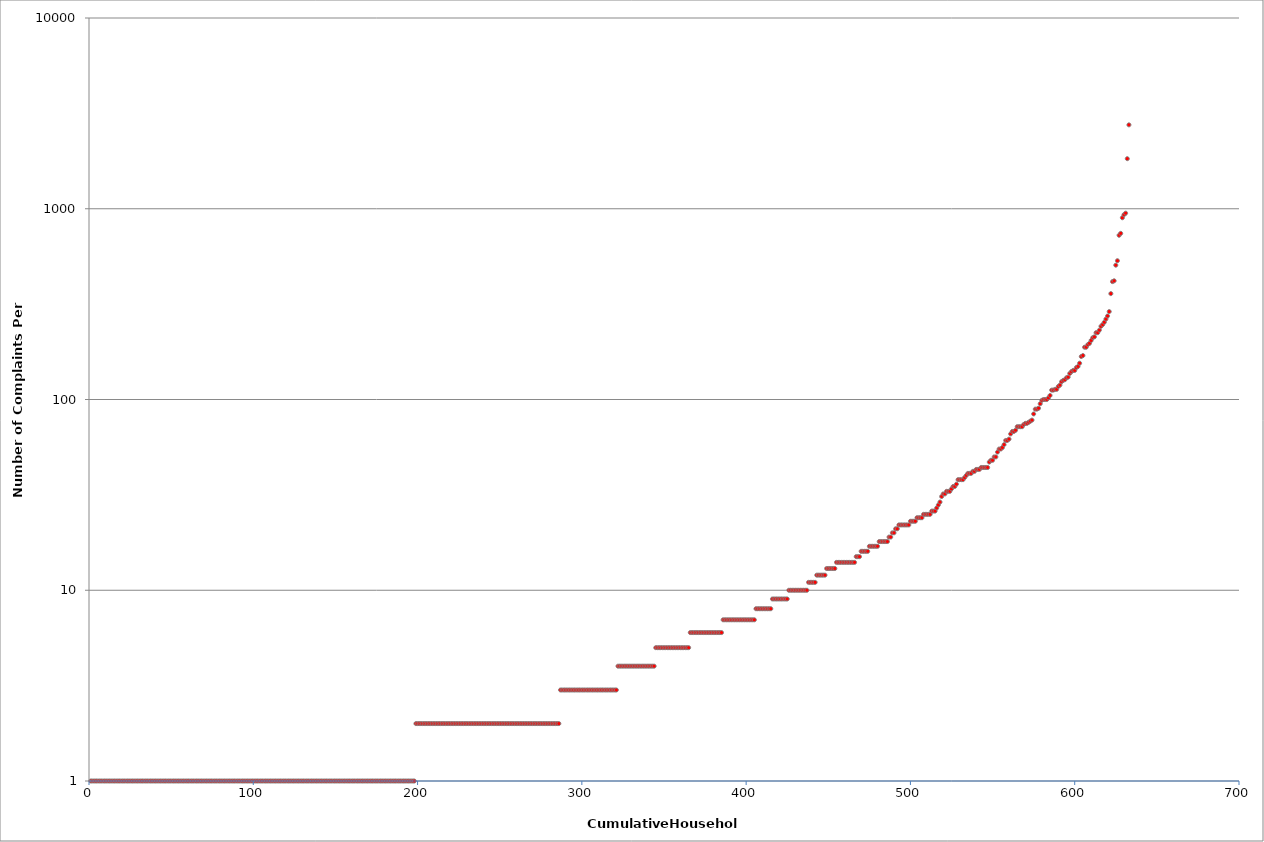
| Category | Series 0 |
|---|---|
| 1.0 | 1 |
| 2.0 | 1 |
| 3.0 | 1 |
| 4.0 | 1 |
| 5.0 | 1 |
| 6.0 | 1 |
| 7.0 | 1 |
| 8.0 | 1 |
| 9.0 | 1 |
| 10.0 | 1 |
| 11.0 | 1 |
| 12.0 | 1 |
| 13.0 | 1 |
| 14.0 | 1 |
| 15.0 | 1 |
| 16.0 | 1 |
| 17.0 | 1 |
| 18.0 | 1 |
| 19.0 | 1 |
| 20.0 | 1 |
| 21.0 | 1 |
| 22.0 | 1 |
| 23.0 | 1 |
| 24.0 | 1 |
| 25.0 | 1 |
| 26.0 | 1 |
| 27.0 | 1 |
| 28.0 | 1 |
| 29.0 | 1 |
| 30.0 | 1 |
| 31.0 | 1 |
| 32.0 | 1 |
| 33.0 | 1 |
| 34.0 | 1 |
| 35.0 | 1 |
| 36.0 | 1 |
| 37.0 | 1 |
| 38.0 | 1 |
| 39.0 | 1 |
| 40.0 | 1 |
| 41.0 | 1 |
| 42.0 | 1 |
| 43.0 | 1 |
| 44.0 | 1 |
| 45.0 | 1 |
| 46.0 | 1 |
| 47.0 | 1 |
| 48.0 | 1 |
| 49.0 | 1 |
| 50.0 | 1 |
| 51.0 | 1 |
| 52.0 | 1 |
| 53.0 | 1 |
| 54.0 | 1 |
| 55.0 | 1 |
| 56.0 | 1 |
| 57.0 | 1 |
| 58.0 | 1 |
| 59.0 | 1 |
| 60.0 | 1 |
| 61.0 | 1 |
| 62.0 | 1 |
| 63.0 | 1 |
| 64.0 | 1 |
| 65.0 | 1 |
| 66.0 | 1 |
| 67.0 | 1 |
| 68.0 | 1 |
| 69.0 | 1 |
| 70.0 | 1 |
| 71.0 | 1 |
| 72.0 | 1 |
| 73.0 | 1 |
| 74.0 | 1 |
| 75.0 | 1 |
| 76.0 | 1 |
| 77.0 | 1 |
| 78.0 | 1 |
| 79.0 | 1 |
| 80.0 | 1 |
| 81.0 | 1 |
| 82.0 | 1 |
| 83.0 | 1 |
| 84.0 | 1 |
| 85.0 | 1 |
| 86.0 | 1 |
| 87.0 | 1 |
| 88.0 | 1 |
| 89.0 | 1 |
| 90.0 | 1 |
| 91.0 | 1 |
| 92.0 | 1 |
| 93.0 | 1 |
| 94.0 | 1 |
| 95.0 | 1 |
| 96.0 | 1 |
| 97.0 | 1 |
| 98.0 | 1 |
| 99.0 | 1 |
| 100.0 | 1 |
| 101.0 | 1 |
| 102.0 | 1 |
| 103.0 | 1 |
| 104.0 | 1 |
| 105.0 | 1 |
| 106.0 | 1 |
| 107.0 | 1 |
| 108.0 | 1 |
| 109.0 | 1 |
| 110.0 | 1 |
| 111.0 | 1 |
| 112.0 | 1 |
| 113.0 | 1 |
| 114.0 | 1 |
| 115.0 | 1 |
| 116.0 | 1 |
| 117.0 | 1 |
| 118.0 | 1 |
| 119.0 | 1 |
| 120.0 | 1 |
| 121.0 | 1 |
| 122.0 | 1 |
| 123.0 | 1 |
| 124.0 | 1 |
| 125.0 | 1 |
| 126.0 | 1 |
| 127.0 | 1 |
| 128.0 | 1 |
| 129.0 | 1 |
| 130.0 | 1 |
| 131.0 | 1 |
| 132.0 | 1 |
| 133.0 | 1 |
| 134.0 | 1 |
| 135.0 | 1 |
| 136.0 | 1 |
| 137.0 | 1 |
| 138.0 | 1 |
| 139.0 | 1 |
| 140.0 | 1 |
| 141.0 | 1 |
| 142.0 | 1 |
| 143.0 | 1 |
| 144.0 | 1 |
| 145.0 | 1 |
| 146.0 | 1 |
| 147.0 | 1 |
| 148.0 | 1 |
| 149.0 | 1 |
| 150.0 | 1 |
| 151.0 | 1 |
| 152.0 | 1 |
| 153.0 | 1 |
| 154.0 | 1 |
| 155.0 | 1 |
| 156.0 | 1 |
| 157.0 | 1 |
| 158.0 | 1 |
| 159.0 | 1 |
| 160.0 | 1 |
| 161.0 | 1 |
| 162.0 | 1 |
| 163.0 | 1 |
| 164.0 | 1 |
| 165.0 | 1 |
| 166.0 | 1 |
| 167.0 | 1 |
| 168.0 | 1 |
| 169.0 | 1 |
| 170.0 | 1 |
| 171.0 | 1 |
| 172.0 | 1 |
| 173.0 | 1 |
| 174.0 | 1 |
| 175.0 | 1 |
| 176.0 | 1 |
| 177.0 | 1 |
| 178.0 | 1 |
| 179.0 | 1 |
| 180.0 | 1 |
| 181.0 | 1 |
| 182.0 | 1 |
| 183.0 | 1 |
| 184.0 | 1 |
| 185.0 | 1 |
| 186.0 | 1 |
| 187.0 | 1 |
| 188.0 | 1 |
| 189.0 | 1 |
| 190.0 | 1 |
| 191.0 | 1 |
| 192.0 | 1 |
| 193.0 | 1 |
| 194.0 | 1 |
| 195.0 | 1 |
| 196.0 | 1 |
| 197.0 | 1 |
| 198.0 | 1 |
| 199.0 | 2 |
| 200.0 | 2 |
| 201.0 | 2 |
| 202.0 | 2 |
| 203.0 | 2 |
| 204.0 | 2 |
| 205.0 | 2 |
| 206.0 | 2 |
| 207.0 | 2 |
| 208.0 | 2 |
| 209.0 | 2 |
| 210.0 | 2 |
| 211.0 | 2 |
| 212.0 | 2 |
| 213.0 | 2 |
| 214.0 | 2 |
| 215.0 | 2 |
| 216.0 | 2 |
| 217.0 | 2 |
| 218.0 | 2 |
| 219.0 | 2 |
| 220.0 | 2 |
| 221.0 | 2 |
| 222.0 | 2 |
| 223.0 | 2 |
| 224.0 | 2 |
| 225.0 | 2 |
| 226.0 | 2 |
| 227.0 | 2 |
| 228.0 | 2 |
| 229.0 | 2 |
| 230.0 | 2 |
| 231.0 | 2 |
| 232.0 | 2 |
| 233.0 | 2 |
| 234.0 | 2 |
| 235.0 | 2 |
| 236.0 | 2 |
| 237.0 | 2 |
| 238.0 | 2 |
| 239.0 | 2 |
| 240.0 | 2 |
| 241.0 | 2 |
| 242.0 | 2 |
| 243.0 | 2 |
| 244.0 | 2 |
| 245.0 | 2 |
| 246.0 | 2 |
| 247.0 | 2 |
| 248.0 | 2 |
| 249.0 | 2 |
| 250.0 | 2 |
| 251.0 | 2 |
| 252.0 | 2 |
| 253.0 | 2 |
| 254.0 | 2 |
| 255.0 | 2 |
| 256.0 | 2 |
| 257.0 | 2 |
| 258.0 | 2 |
| 259.0 | 2 |
| 260.0 | 2 |
| 261.0 | 2 |
| 262.0 | 2 |
| 263.0 | 2 |
| 264.0 | 2 |
| 265.0 | 2 |
| 266.0 | 2 |
| 267.0 | 2 |
| 268.0 | 2 |
| 269.0 | 2 |
| 270.0 | 2 |
| 271.0 | 2 |
| 272.0 | 2 |
| 273.0 | 2 |
| 274.0 | 2 |
| 275.0 | 2 |
| 276.0 | 2 |
| 277.0 | 2 |
| 278.0 | 2 |
| 279.0 | 2 |
| 280.0 | 2 |
| 281.0 | 2 |
| 282.0 | 2 |
| 283.0 | 2 |
| 284.0 | 2 |
| 285.0 | 2 |
| 286.0 | 2 |
| 287.0 | 3 |
| 288.0 | 3 |
| 289.0 | 3 |
| 290.0 | 3 |
| 291.0 | 3 |
| 292.0 | 3 |
| 293.0 | 3 |
| 294.0 | 3 |
| 295.0 | 3 |
| 296.0 | 3 |
| 297.0 | 3 |
| 298.0 | 3 |
| 299.0 | 3 |
| 300.0 | 3 |
| 301.0 | 3 |
| 302.0 | 3 |
| 303.0 | 3 |
| 304.0 | 3 |
| 305.0 | 3 |
| 306.0 | 3 |
| 307.0 | 3 |
| 308.0 | 3 |
| 309.0 | 3 |
| 310.0 | 3 |
| 311.0 | 3 |
| 312.0 | 3 |
| 313.0 | 3 |
| 314.0 | 3 |
| 315.0 | 3 |
| 316.0 | 3 |
| 317.0 | 3 |
| 318.0 | 3 |
| 319.0 | 3 |
| 320.0 | 3 |
| 321.0 | 3 |
| 322.0 | 4 |
| 323.0 | 4 |
| 324.0 | 4 |
| 325.0 | 4 |
| 326.0 | 4 |
| 327.0 | 4 |
| 328.0 | 4 |
| 329.0 | 4 |
| 330.0 | 4 |
| 331.0 | 4 |
| 332.0 | 4 |
| 333.0 | 4 |
| 334.0 | 4 |
| 335.0 | 4 |
| 336.0 | 4 |
| 337.0 | 4 |
| 338.0 | 4 |
| 339.0 | 4 |
| 340.0 | 4 |
| 341.0 | 4 |
| 342.0 | 4 |
| 343.0 | 4 |
| 344.0 | 4 |
| 345.0 | 5 |
| 346.0 | 5 |
| 347.0 | 5 |
| 348.0 | 5 |
| 349.0 | 5 |
| 350.0 | 5 |
| 351.0 | 5 |
| 352.0 | 5 |
| 353.0 | 5 |
| 354.0 | 5 |
| 355.0 | 5 |
| 356.0 | 5 |
| 357.0 | 5 |
| 358.0 | 5 |
| 359.0 | 5 |
| 360.0 | 5 |
| 361.0 | 5 |
| 362.0 | 5 |
| 363.0 | 5 |
| 364.0 | 5 |
| 365.0 | 5 |
| 366.0 | 6 |
| 367.0 | 6 |
| 368.0 | 6 |
| 369.0 | 6 |
| 370.0 | 6 |
| 371.0 | 6 |
| 372.0 | 6 |
| 373.0 | 6 |
| 374.0 | 6 |
| 375.0 | 6 |
| 376.0 | 6 |
| 377.0 | 6 |
| 378.0 | 6 |
| 379.0 | 6 |
| 380.0 | 6 |
| 381.0 | 6 |
| 382.0 | 6 |
| 383.0 | 6 |
| 384.0 | 6 |
| 385.0 | 6 |
| 386.0 | 7 |
| 387.0 | 7 |
| 388.0 | 7 |
| 389.0 | 7 |
| 390.0 | 7 |
| 391.0 | 7 |
| 392.0 | 7 |
| 393.0 | 7 |
| 394.0 | 7 |
| 395.0 | 7 |
| 396.0 | 7 |
| 397.0 | 7 |
| 398.0 | 7 |
| 399.0 | 7 |
| 400.0 | 7 |
| 401.0 | 7 |
| 402.0 | 7 |
| 403.0 | 7 |
| 404.0 | 7 |
| 405.0 | 7 |
| 406.0 | 8 |
| 407.0 | 8 |
| 408.0 | 8 |
| 409.0 | 8 |
| 410.0 | 8 |
| 411.0 | 8 |
| 412.0 | 8 |
| 413.0 | 8 |
| 414.0 | 8 |
| 415.0 | 8 |
| 416.0 | 9 |
| 417.0 | 9 |
| 418.0 | 9 |
| 419.0 | 9 |
| 420.0 | 9 |
| 421.0 | 9 |
| 422.0 | 9 |
| 423.0 | 9 |
| 424.0 | 9 |
| 425.0 | 9 |
| 426.0 | 10 |
| 427.0 | 10 |
| 428.0 | 10 |
| 429.0 | 10 |
| 430.0 | 10 |
| 431.0 | 10 |
| 432.0 | 10 |
| 433.0 | 10 |
| 434.0 | 10 |
| 435.0 | 10 |
| 436.0 | 10 |
| 437.0 | 10 |
| 438.0 | 11 |
| 439.0 | 11 |
| 440.0 | 11 |
| 441.0 | 11 |
| 442.0 | 11 |
| 443.0 | 12 |
| 444.0 | 12 |
| 445.0 | 12 |
| 446.0 | 12 |
| 447.0 | 12 |
| 448.0 | 12 |
| 449.0 | 13 |
| 450.0 | 13 |
| 451.0 | 13 |
| 452.0 | 13 |
| 453.0 | 13 |
| 454.0 | 13 |
| 455.0 | 14 |
| 456.0 | 14 |
| 457.0 | 14 |
| 458.0 | 14 |
| 459.0 | 14 |
| 460.0 | 14 |
| 461.0 | 14 |
| 462.0 | 14 |
| 463.0 | 14 |
| 464.0 | 14 |
| 465.0 | 14 |
| 466.0 | 14 |
| 467.0 | 15 |
| 468.0 | 15 |
| 469.0 | 15 |
| 470.0 | 16 |
| 471.0 | 16 |
| 472.0 | 16 |
| 473.0 | 16 |
| 474.0 | 16 |
| 475.0 | 17 |
| 476.0 | 17 |
| 477.0 | 17 |
| 478.0 | 17 |
| 479.0 | 17 |
| 480.0 | 17 |
| 481.0 | 18 |
| 482.0 | 18 |
| 483.0 | 18 |
| 484.0 | 18 |
| 485.0 | 18 |
| 486.0 | 18 |
| 487.0 | 19 |
| 488.0 | 19 |
| 489.0 | 20 |
| 490.0 | 20 |
| 491.0 | 21 |
| 492.0 | 21 |
| 493.0 | 22 |
| 494.0 | 22 |
| 495.0 | 22 |
| 496.0 | 22 |
| 497.0 | 22 |
| 498.0 | 22 |
| 499.0 | 22 |
| 500.0 | 23 |
| 501.0 | 23 |
| 502.0 | 23 |
| 503.0 | 23 |
| 504.0 | 24 |
| 505.0 | 24 |
| 506.0 | 24 |
| 507.0 | 24 |
| 508.0 | 25 |
| 509.0 | 25 |
| 510.0 | 25 |
| 511.0 | 25 |
| 512.0 | 25 |
| 513.0 | 26 |
| 514.0 | 26 |
| 515.0 | 26 |
| 516.0 | 27 |
| 517.0 | 28 |
| 518.0 | 29 |
| 519.0 | 31 |
| 520.0 | 32 |
| 521.0 | 32 |
| 522.0 | 33 |
| 523.0 | 33 |
| 524.0 | 33 |
| 525.0 | 34 |
| 526.0 | 35 |
| 527.0 | 35 |
| 528.0 | 36 |
| 529.0 | 38 |
| 530.0 | 38 |
| 531.0 | 38 |
| 532.0 | 38 |
| 533.0 | 39 |
| 534.0 | 40 |
| 535.0 | 41 |
| 536.0 | 41 |
| 537.0 | 41 |
| 538.0 | 42 |
| 539.0 | 42 |
| 540.0 | 43 |
| 541.0 | 43 |
| 542.0 | 43 |
| 543.0 | 44 |
| 544.0 | 44 |
| 545.0 | 44 |
| 546.0 | 44 |
| 547.0 | 44 |
| 548.0 | 47 |
| 549.0 | 48 |
| 550.0 | 48 |
| 551.0 | 50 |
| 552.0 | 50 |
| 553.0 | 53 |
| 554.0 | 55 |
| 555.0 | 55 |
| 556.0 | 56 |
| 557.0 | 58 |
| 558.0 | 61 |
| 559.0 | 61 |
| 560.0 | 62 |
| 561.0 | 66 |
| 562.0 | 68 |
| 563.0 | 68 |
| 564.0 | 69 |
| 565.0 | 72 |
| 566.0 | 72 |
| 567.0 | 72 |
| 568.0 | 72 |
| 569.0 | 74 |
| 570.0 | 75 |
| 571.0 | 75 |
| 572.0 | 76 |
| 573.0 | 77 |
| 574.0 | 78 |
| 575.0 | 84 |
| 576.0 | 89 |
| 577.0 | 89 |
| 578.0 | 90 |
| 579.0 | 95 |
| 580.0 | 99 |
| 581.0 | 100 |
| 582.0 | 100 |
| 583.0 | 100 |
| 584.0 | 102 |
| 585.0 | 105 |
| 586.0 | 112 |
| 587.0 | 112 |
| 588.0 | 113 |
| 589.0 | 113 |
| 590.0 | 117 |
| 591.0 | 119 |
| 592.0 | 124 |
| 593.0 | 126 |
| 594.0 | 127 |
| 595.0 | 130 |
| 596.0 | 131 |
| 597.0 | 137 |
| 598.0 | 140 |
| 599.0 | 142 |
| 600.0 | 142 |
| 601.0 | 147 |
| 602.0 | 149 |
| 603.0 | 155 |
| 604.0 | 168 |
| 605.0 | 170 |
| 606.0 | 188 |
| 607.0 | 188 |
| 608.0 | 194 |
| 609.0 | 197 |
| 610.0 | 204 |
| 611.0 | 211 |
| 612.0 | 213 |
| 613.0 | 224 |
| 614.0 | 224 |
| 615.0 | 231 |
| 616.0 | 242 |
| 617.0 | 247 |
| 618.0 | 254 |
| 619.0 | 264 |
| 620.0 | 274 |
| 621.0 | 289 |
| 622.0 | 359 |
| 623.0 | 415 |
| 624.0 | 419 |
| 625.0 | 506 |
| 626.0 | 534 |
| 627.0 | 726 |
| 628.0 | 743 |
| 629.0 | 897 |
| 630.0 | 931 |
| 631.0 | 948 |
| 632.0 | 1830 |
| 633.0 | 2753 |